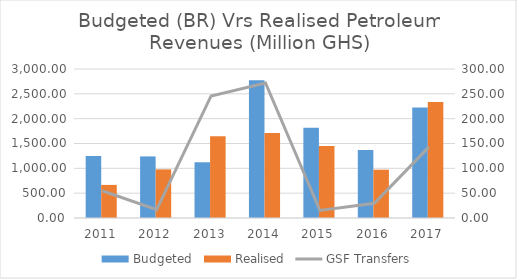
| Category | Budgeted  | Realised |
|---|---|---|
| 2011.0 | 1250 | 666.2 |
| 2012.0 | 1239.82 | 979.32 |
| 2013.0 | 1122.72 | 1645.59 |
| 2014.0 | 2774.92 | 1709.4 |
| 2015.0 | 1816.42 | 1449.92 |
| 2016.0 | 1370.89 | 972.55 |
| 2017.0 | 2227.26 | 2334.12 |